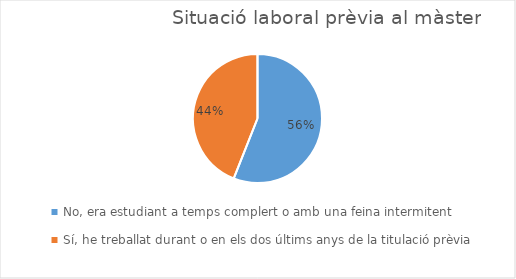
| Category | Series 0 |
|---|---|
| No, era estudiant a temps complert o amb una feina intermitent
 | 14 |
| Sí, he treballat durant o en els dos últims anys de la titulació prèvia | 11 |